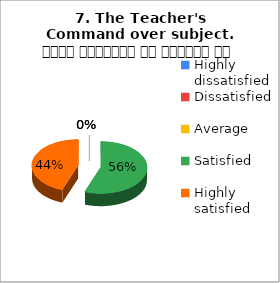
| Category | 7. The Teacher's Command over subject. विषय अवधारणा पर शिक्षक का ज्ञान |
|---|---|
| Highly dissatisfied | 0 |
| Dissatisfied | 0 |
| Average | 0 |
| Satisfied | 5 |
| Highly satisfied | 4 |